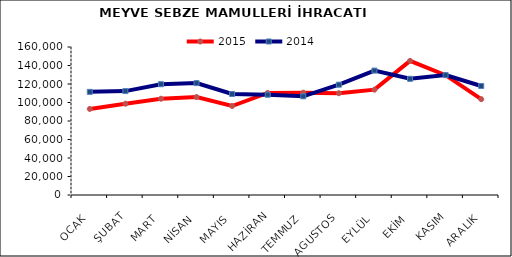
| Category | 2015 | 2014 |
|---|---|---|
| OCAK | 93040.151 | 111498.515 |
| ŞUBAT | 98704.324 | 112326 |
| MART | 104061.685 | 119768.885 |
| NİSAN | 105917.708 | 120977.543 |
| MAYIS | 96206.019 | 109161.335 |
| HAZİRAN | 110324.242 | 108378.8 |
| TEMMUZ | 110605.694 | 106680.224 |
| AGUSTOS | 110058.642 | 119251.822 |
| EYLÜL | 113863.188 | 134477.106 |
| EKİM | 144968.695 | 125615.465 |
| KASIM | 129541.556 | 129613.564 |
| ARALIK | 103599.459 | 117865.614 |